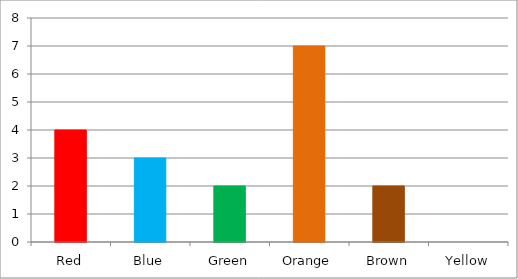
| Category | Series 0 |
|---|---|
| Red | 4 |
| Blue | 3 |
| Green | 2 |
| Orange | 7 |
| Brown | 2 |
| Yellow | 0 |